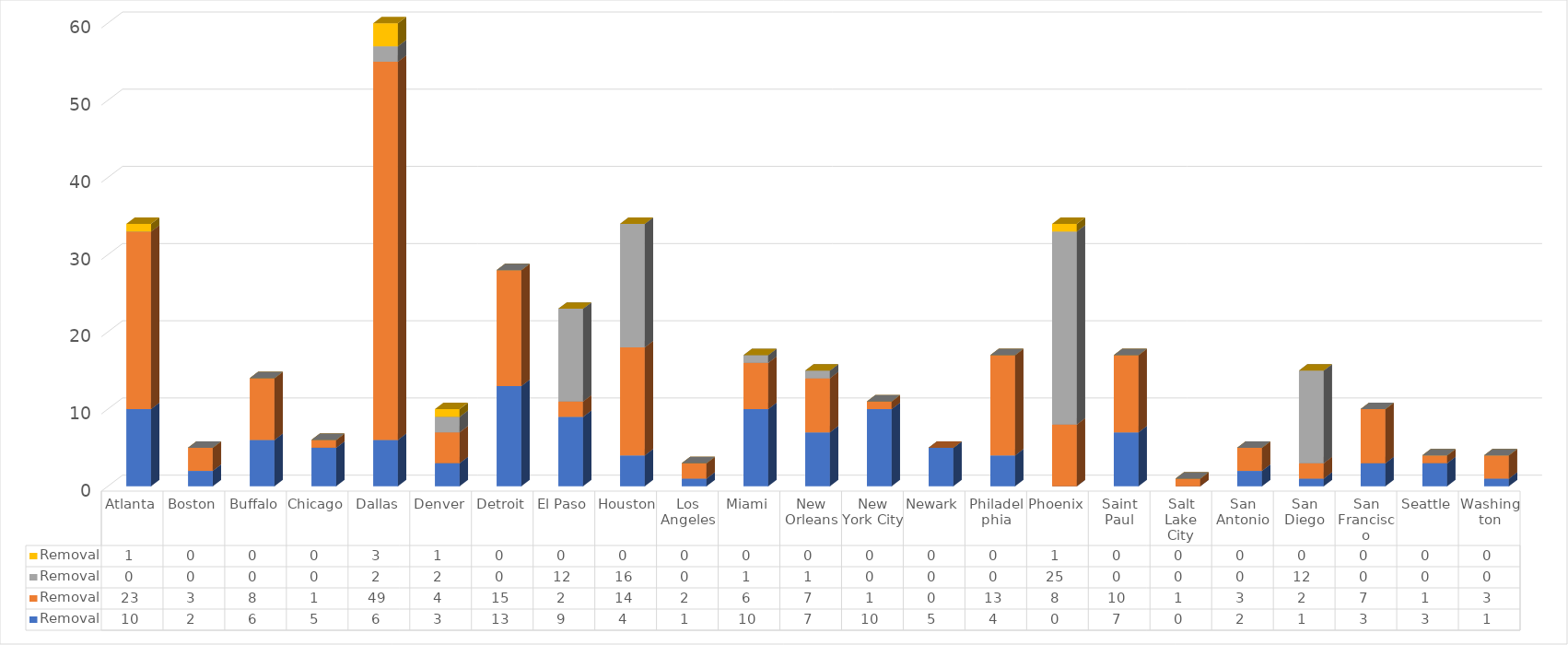
| Category | Sum of Other Priority - Removal | Sum of Public Safety - Removal | Sum of Border Security - Removal | Sum of National Security - Removal |
|---|---|---|---|---|
| Atlanta | 10 | 23 | 0 | 1 |
| Boston | 2 | 3 | 0 | 0 |
| Buffalo | 6 | 8 | 0 | 0 |
| Chicago | 5 | 1 | 0 | 0 |
| Dallas | 6 | 49 | 2 | 3 |
| Denver | 3 | 4 | 2 | 1 |
| Detroit | 13 | 15 | 0 | 0 |
| El Paso | 9 | 2 | 12 | 0 |
| Houston | 4 | 14 | 16 | 0 |
| Los Angeles | 1 | 2 | 0 | 0 |
| Miami | 10 | 6 | 1 | 0 |
| New Orleans | 7 | 7 | 1 | 0 |
| New York City | 10 | 1 | 0 | 0 |
| Newark | 5 | 0 | 0 | 0 |
| Philadelphia | 4 | 13 | 0 | 0 |
| Phoenix | 0 | 8 | 25 | 1 |
| Saint Paul | 7 | 10 | 0 | 0 |
| Salt Lake City | 0 | 1 | 0 | 0 |
| San Antonio | 2 | 3 | 0 | 0 |
| San Diego | 1 | 2 | 12 | 0 |
| San Francisco | 3 | 7 | 0 | 0 |
| Seattle | 3 | 1 | 0 | 0 |
| Washington | 1 | 3 | 0 | 0 |